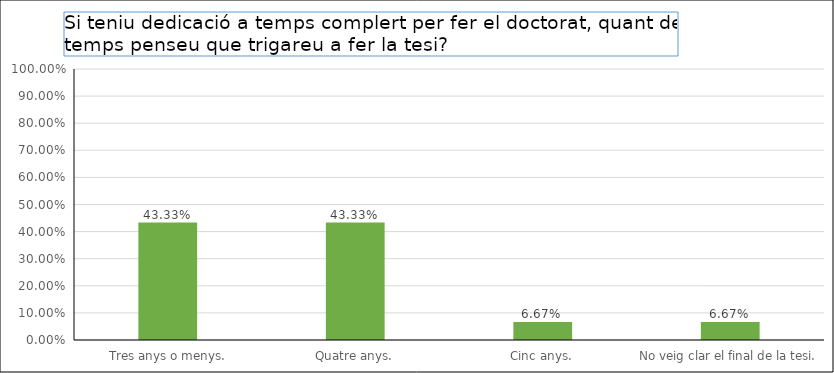
| Category | Series 0 |
|---|---|
|  Tres anys o menys. | 0.433 |
| Quatre anys. | 0.433 |
| Cinc anys. | 0.067 |
| No veig clar el final de la tesi. | 0.067 |